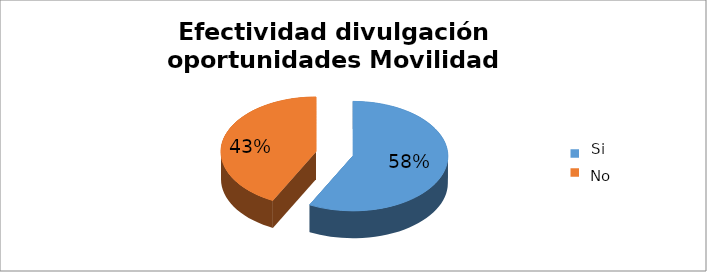
| Category | Series 0 |
|---|---|
| 0 | 0.575 |
| 1 | 0.425 |